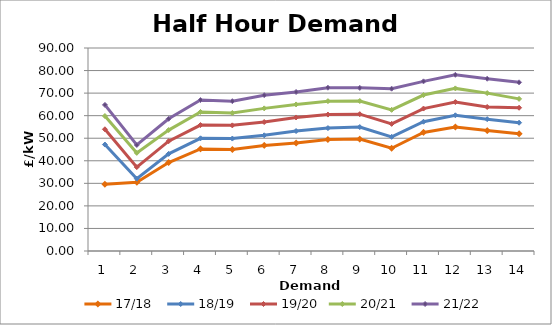
| Category | 17/18  | 18/19  | 19/20 | 20/21  | 21/22  |
|---|---|---|---|---|---|
| 1.0 | 29.578 | 47.198 | 53.958 | 59.832 | 64.776 |
| 2.0 | 30.481 | 32.067 | 37.197 | 43.504 | 47.004 |
| 3.0 | 39.223 | 43.059 | 48.698 | 53.613 | 58.599 |
| 4.0 | 45.246 | 49.962 | 55.843 | 61.637 | 66.935 |
| 5.0 | 44.967 | 49.845 | 55.7 | 61.174 | 66.428 |
| 6.0 | 46.791 | 51.293 | 57.176 | 63.237 | 69.084 |
| 7.0 | 47.889 | 53.178 | 59.203 | 64.973 | 70.503 |
| 8.0 | 49.457 | 54.492 | 60.486 | 66.435 | 72.408 |
| 9.0 | 49.617 | 54.948 | 60.663 | 66.492 | 72.326 |
| 10.0 | 45.552 | 50.61 | 56.362 | 62.575 | 71.968 |
| 11.0 | 52.538 | 57.305 | 63.151 | 69.139 | 75.21 |
| 12.0 | 54.97 | 60.156 | 66.018 | 72.09 | 78.107 |
| 13.0 | 53.405 | 58.443 | 63.853 | 69.997 | 76.379 |
| 14.0 | 51.956 | 56.887 | 63.506 | 67.444 | 74.778 |